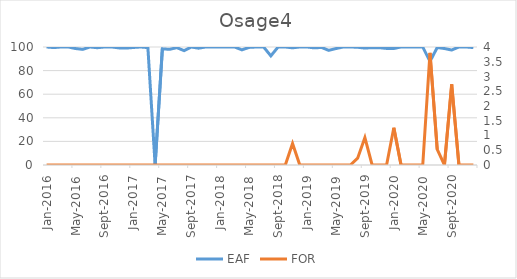
| Category | EAF |
|---|---|
| 2016-01-01 | 100 |
| 2016-02-01 | 99.5 |
| 2016-03-01 | 100 |
| 2016-04-01 | 100 |
| 2016-05-01 | 98.69 |
| 2016-06-01 | 98 |
| 2016-07-01 | 100 |
| 2016-08-01 | 99.4 |
| 2016-09-01 | 100 |
| 2016-10-01 | 100 |
| 2016-11-01 | 99.25 |
| 2016-12-01 | 99.07 |
| 2017-01-01 | 99.6 |
| 2017-02-01 | 100 |
| 2017-03-01 | 99.48 |
| 2017-04-01 | 0 |
| 2017-05-01 | 98.45 |
| 2017-06-01 | 98.01 |
| 2017-07-01 | 99.46 |
| 2017-08-01 | 96.92 |
| 2017-09-01 | 100 |
| 2017-10-01 | 98.99 |
| 2017-11-01 | 100 |
| 2017-12-01 | 100 |
| 2018-01-01 | 100 |
| 2018-02-01 | 100 |
| 2018-03-01 | 100 |
| 2018-04-01 | 97.57 |
| 2018-05-01 | 99.66 |
| 2018-06-01 | 100 |
| 2018-07-01 | 100 |
| 2018-08-01 | 92.47 |
| 2018-09-01 | 100 |
| 2018-10-01 | 100 |
| 2018-11-01 | 99.31 |
| 2018-12-01 | 100 |
| 2019-01-01 | 100 |
| 2019-02-01 | 99.26 |
| 2019-03-01 | 99.63 |
| 2019-04-01 | 97.15 |
| 2019-05-01 | 98.68 |
| 2019-06-01 | 100 |
| 2019-07-01 | 100 |
| 2019-08-01 | 99.77 |
| 2019-09-01 | 99.09 |
| 2019-10-01 | 99.46 |
| 2019-11-01 | 99.42 |
| 2019-12-01 | 98.79 |
| 2020-01-01 | 98.75 |
| 2020-02-01 | 100 |
| 2020-03-01 | 100 |
| 2020-04-01 | 100 |
| 2020-05-01 | 100 |
| 2020-06-01 | 87.78 |
| 2020-07-01 | 99.56 |
| 2020-08-01 | 98.69 |
| 2020-09-01 | 97.44 |
| 2020-10-01 | 100 |
| 2020-11-01 | 100 |
| 2020-12-01 | 99.51 |